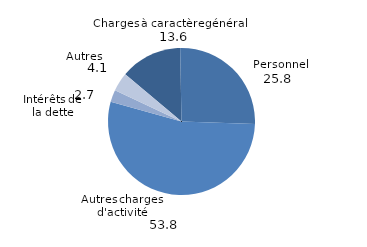
| Category | Series 0 |
|---|---|
| 0 | 13.599 |
| 1 | 25.814 |
| 2 | 53.779 |
| 3 | 2.687 |
| 4 | 4.12 |